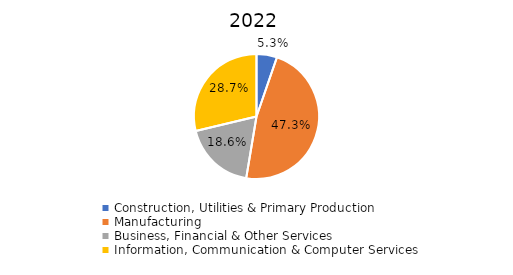
| Category | 2022 |
|---|---|
| Construction, Utilities & Primary Production  | 0.053 |
| Manufacturing  | 0.473 |
| Business, Financial & Other Services | 0.186 |
| Information, Communication & Computer Services | 0.287 |